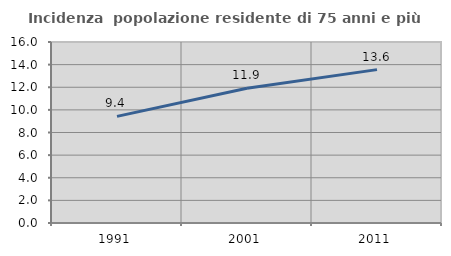
| Category | Incidenza  popolazione residente di 75 anni e più |
|---|---|
| 1991.0 | 9.425 |
| 2001.0 | 11.92 |
| 2011.0 | 13.557 |